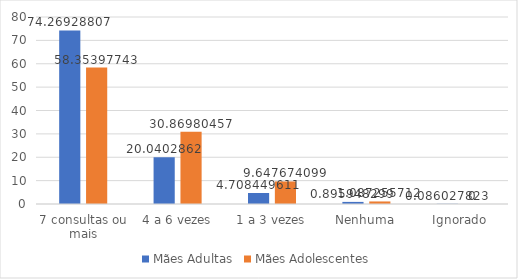
| Category | Mães Adultas | Mães Adolescentes |
|---|---|---|
| 7 consultas ou mais | 74.269 | 58.354 |
| 4 a 6 vezes | 20.04 | 30.87 |
| 1 a 3 vezes | 4.708 | 9.648 |
| Nenhuma | 0.896 | 1.087 |
| Ignorado | 0.086 | 0 |